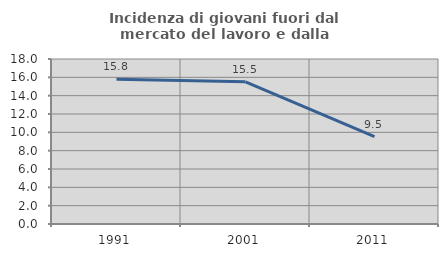
| Category | Incidenza di giovani fuori dal mercato del lavoro e dalla formazione  |
|---|---|
| 1991.0 | 15.789 |
| 2001.0 | 15.517 |
| 2011.0 | 9.524 |